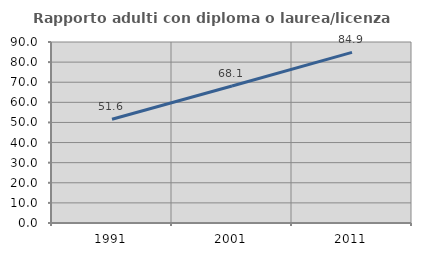
| Category | Rapporto adulti con diploma o laurea/licenza media  |
|---|---|
| 1991.0 | 51.59 |
| 2001.0 | 68.122 |
| 2011.0 | 84.859 |